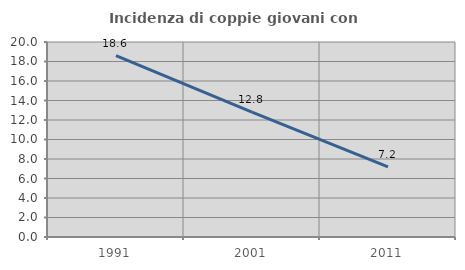
| Category | Incidenza di coppie giovani con figli |
|---|---|
| 1991.0 | 18.594 |
| 2001.0 | 12.813 |
| 2011.0 | 7.197 |